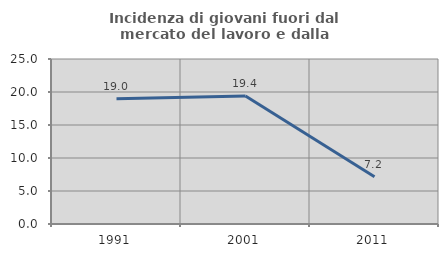
| Category | Incidenza di giovani fuori dal mercato del lavoro e dalla formazione  |
|---|---|
| 1991.0 | 18.977 |
| 2001.0 | 19.398 |
| 2011.0 | 7.171 |